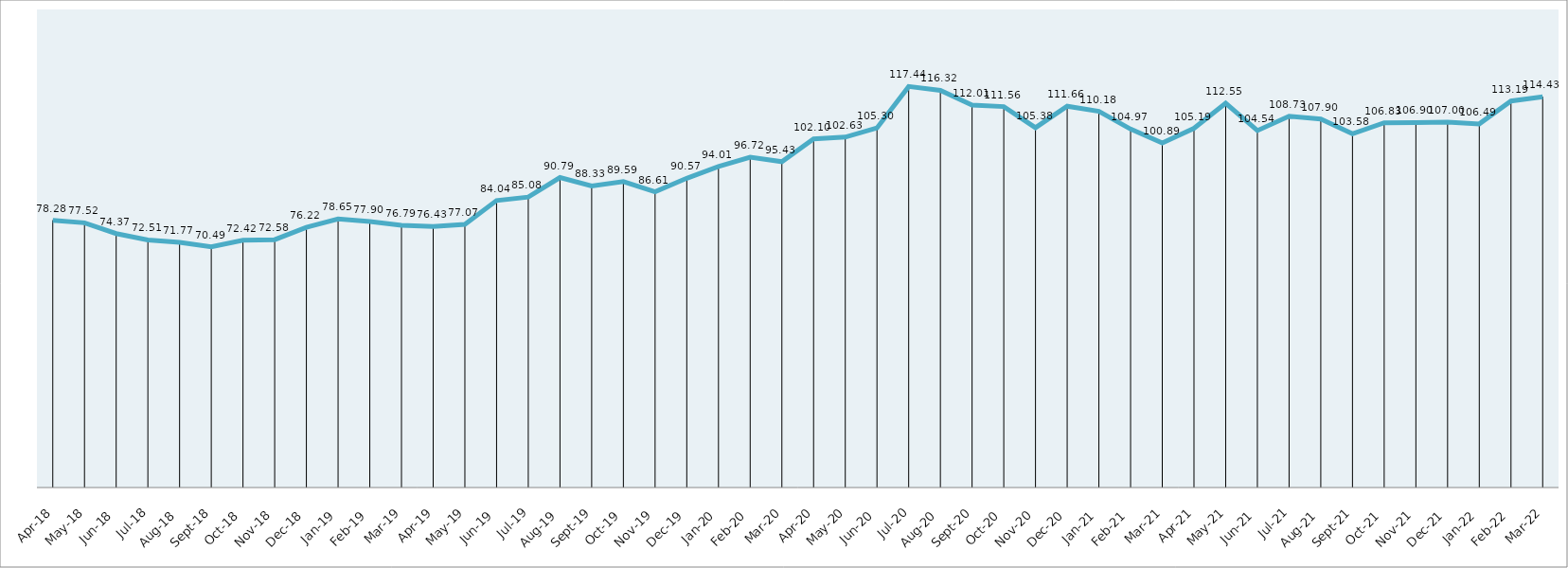
| Category | Series 0 |
|---|---|
| 2018-04-30 | 78.278 |
| 2018-05-31 | 77.52 |
| 2018-06-30 | 74.371 |
| 2018-07-31 | 72.507 |
| 2018-08-31 | 71.772 |
| 2018-09-30 | 70.491 |
| 2018-10-31 | 72.417 |
| 2018-11-30 | 72.581 |
| 2018-12-31 | 76.221 |
| 2019-01-31 | 78.65 |
| 2019-02-28 | 77.904 |
| 2019-03-31 | 76.786 |
| 2019-04-30 | 76.429 |
| 2019-05-31 | 77.074 |
| 2019-06-30 | 84.044 |
| 2019-07-31 | 85.076 |
| 2019-08-31 | 90.785 |
| 2019-09-30 | 88.332 |
| 2019-10-31 | 89.587 |
| 2019-11-30 | 86.61 |
| 2019-12-31 | 90.574 |
| 2020-01-31 | 94.014 |
| 2020-02-29 | 96.72 |
| 2020-03-31 | 95.43 |
| 2020-04-30 | 102.096 |
| 2020-05-31 | 102.626 |
| 2020-06-30 | 105.305 |
| 2020-07-31 | 117.437 |
| 2020-08-31 | 116.316 |
| 2020-09-30 | 112.007 |
| 2020-10-31 | 111.555 |
| 2020-11-30 | 105.379 |
| 2020-12-31 | 111.659 |
| 2021-01-31 | 110.181 |
| 2021-02-28 | 104.972 |
| 2021-03-31 | 100.892 |
| 2021-04-30 | 105.192 |
| 2021-05-31 | 112.545 |
| 2021-06-30 | 104.538 |
| 2021-07-31 | 108.727 |
| 2021-08-31 | 107.898 |
| 2021-09-30 | 103.577 |
| 2021-10-31 | 106.827 |
| 2021-11-30 | 106.905 |
| 2021-12-31 | 107.003 |
| 2022-01-31 | 106.488 |
| 2022-02-28 | 113.191 |
| 2022-03-31 | 114.428 |